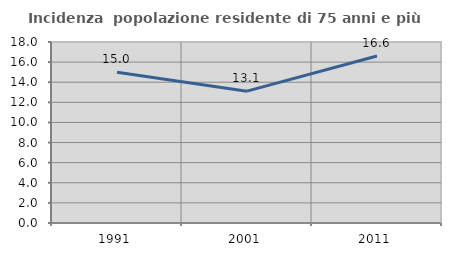
| Category | Incidenza  popolazione residente di 75 anni e più |
|---|---|
| 1991.0 | 15 |
| 2001.0 | 13.11 |
| 2011.0 | 16.614 |